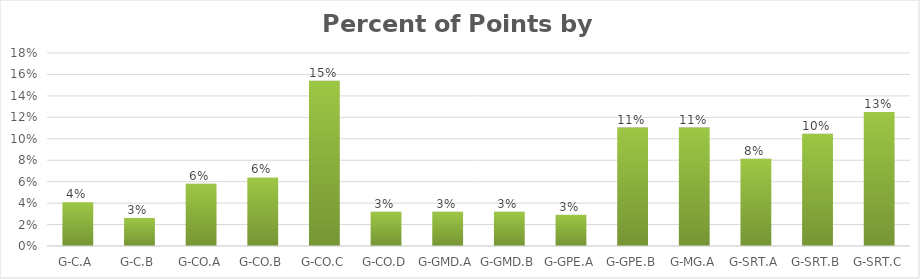
| Category | Percent |
|---|---|
| G-C.A | 0.041 |
| G-C.B | 0.026 |
| G-CO.A | 0.058 |
| G-CO.B | 0.064 |
| G-CO.C | 0.154 |
| G-CO.D | 0.032 |
| G-GMD.A | 0.032 |
| G-GMD.B | 0.032 |
| G-GPE.A | 0.029 |
| G-GPE.B | 0.11 |
| G-MG.A | 0.11 |
| G-SRT.A | 0.081 |
| G-SRT.B | 0.105 |
| G-SRT.C | 0.125 |